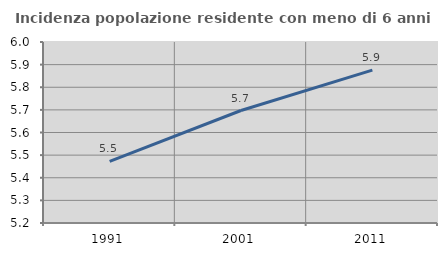
| Category | Incidenza popolazione residente con meno di 6 anni |
|---|---|
| 1991.0 | 5.472 |
| 2001.0 | 5.697 |
| 2011.0 | 5.876 |